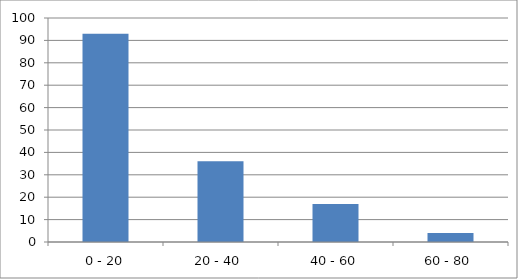
| Category | Series 0 |
|---|---|
| 0 - 20 | 93 |
| 20 - 40 | 36 |
| 40 - 60 | 17 |
| 60 - 80 | 4 |